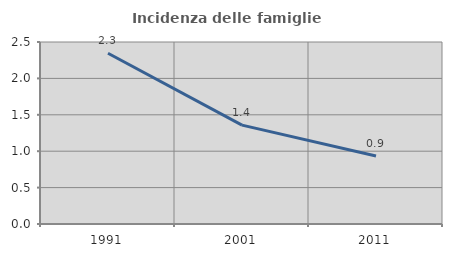
| Category | Incidenza delle famiglie numerose |
|---|---|
| 1991.0 | 2.346 |
| 2001.0 | 1.359 |
| 2011.0 | 0.935 |